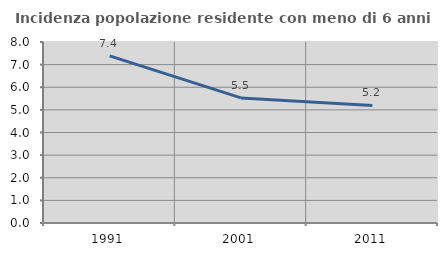
| Category | Incidenza popolazione residente con meno di 6 anni |
|---|---|
| 1991.0 | 7.39 |
| 2001.0 | 5.527 |
| 2011.0 | 5.199 |